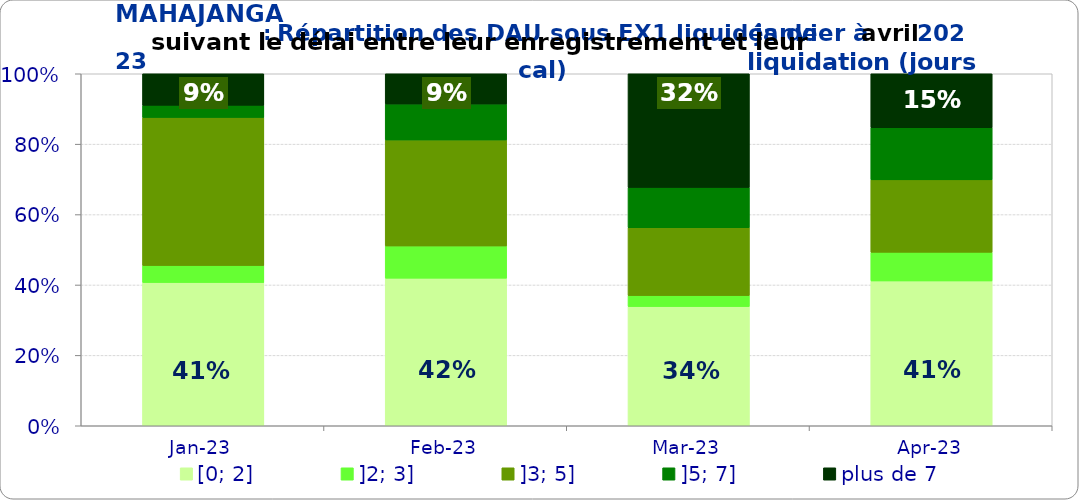
| Category | [0; 2] | ]2; 3] | ]3; 5] | ]5; 7] | plus de 7 |
|---|---|---|---|---|---|
| 2023-01-01 | 0.407 | 0.048 | 0.421 | 0.034 | 0.09 |
| 2023-02-01 | 0.419 | 0.091 | 0.301 | 0.102 | 0.086 |
| 2023-03-01 | 0.339 | 0.031 | 0.193 | 0.115 | 0.323 |
| 2023-04-01 | 0.411 | 0.081 | 0.206 | 0.148 | 0.153 |